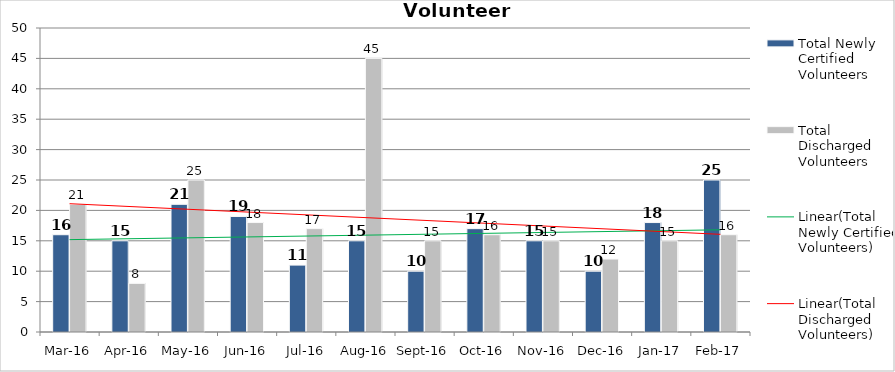
| Category | Total Newly Certified Volunteers | Total Discharged Volunteers |
|---|---|---|
| Mar-16 | 16 | 21 |
| Apr-16 | 15 | 8 |
| May-16 | 21 | 25 |
| Jun-16 | 19 | 18 |
| Jul-16 | 11 | 17 |
| Aug-16 | 15 | 45 |
| Sep-16 | 10 | 15 |
| Oct-16 | 17 | 16 |
| Nov-16 | 15 | 15 |
| Dec-16 | 10 | 12 |
| Jan-17 | 18 | 15 |
| Feb-17 | 25 | 16 |